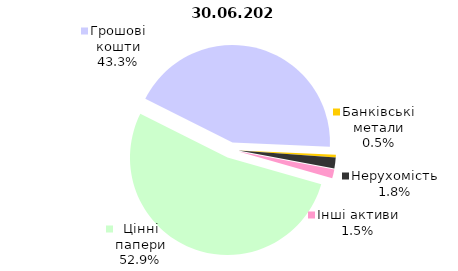
| Category | 30.06.2023 |
|---|---|
| Цінні папери | 2372.621 |
| Грошові кошти | 1940.881 |
| Банківські метали | 20.695 |
| Нерухомість | 80.119 |
| Інші активи | 67.181 |